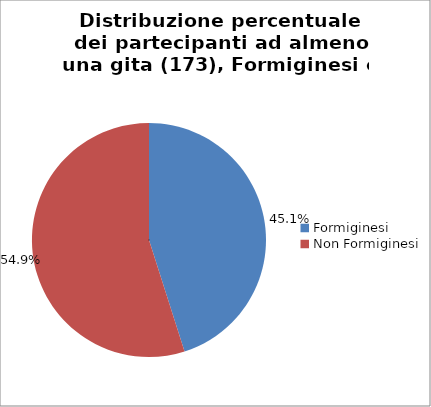
| Category | Nr. Tesserati |
|---|---|
| Formiginesi | 78 |
| Non Formiginesi | 95 |